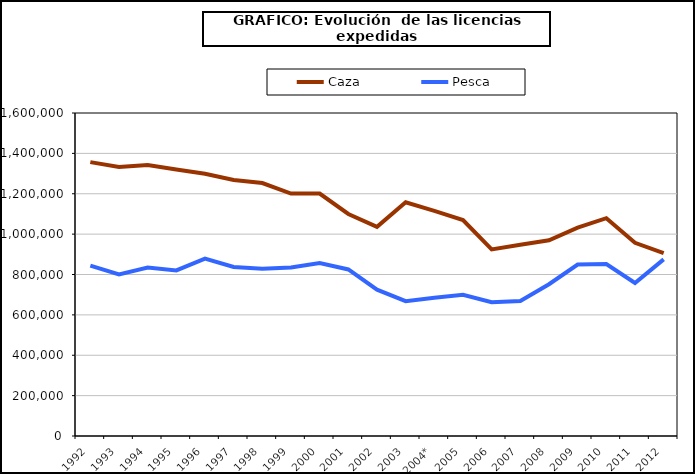
| Category | Caza | Pesca |
|---|---|---|
| 1992 | 1356553 | 844299 |
| 1993 | 1332252 | 799990 |
| 1994 | 1342603 | 834085 |
| 1995 | 1320315 | 820252 |
| 1996 | 1298860 | 878282 |
| 1997 | 1268057 | 837092 |
| 1998 | 1253105 | 829083 |
| 1999 | 1200951 | 834680 |
| 2000 | 1200875 | 856450 |
| 2001 | 1099856 | 825020 |
| 2002 | 1036340 | 724800 |
| 2003 | 1157969 | 667655 |
| 2004* | 1115000 | 685000 |
| 2005 | 1069804 | 699078 |
| 2006 | 924524 | 663000 |
| 2007 | 946965 | 668685 |
| 2008 | 969298 | 751937 |
| 2009 | 1032242 | 849102 |
| 2010 | 1078852 | 851759 |
| 2011 | 957191 | 758018 |
| 2012 | 906437 | 874802 |